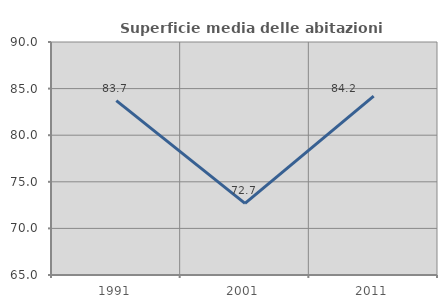
| Category | Superficie media delle abitazioni occupate |
|---|---|
| 1991.0 | 83.706 |
| 2001.0 | 72.69 |
| 2011.0 | 84.193 |